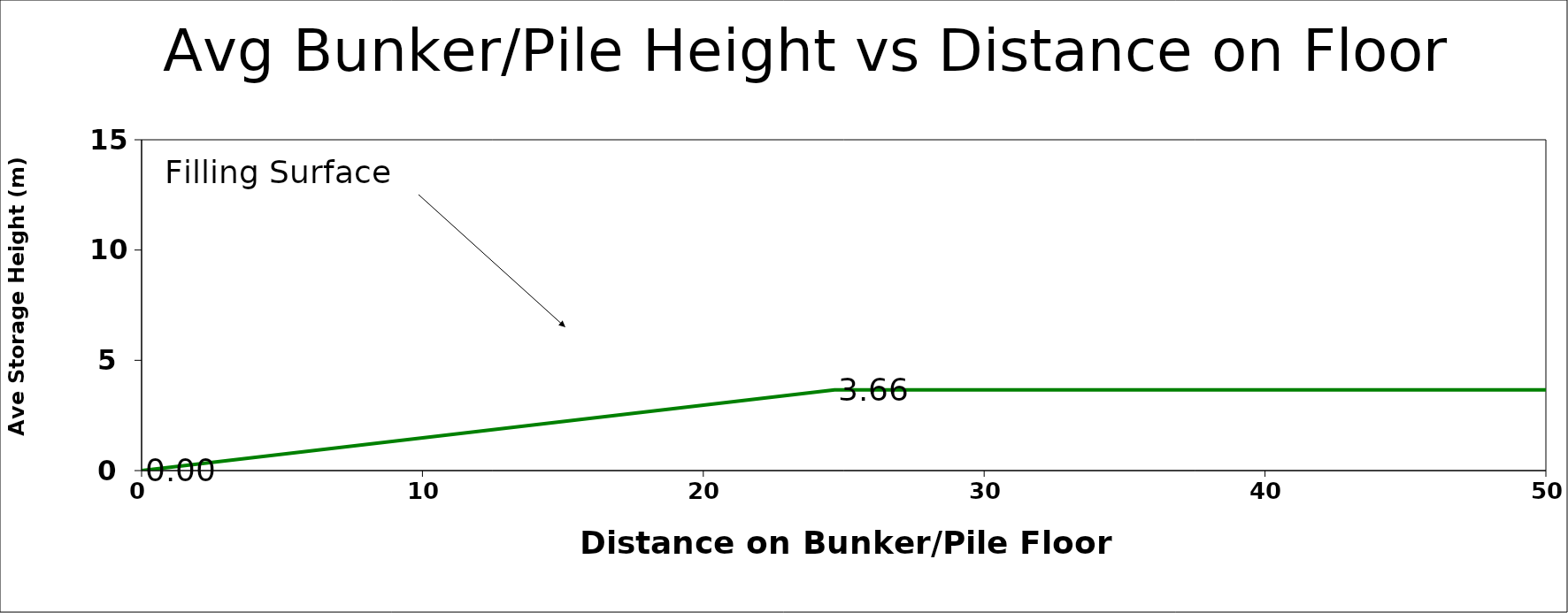
| Category | Cross Section |
|---|---|
| 0.0 | 0 |
| 24.672981263067506 | 3.66 |
| 150.0 | 3.66 |